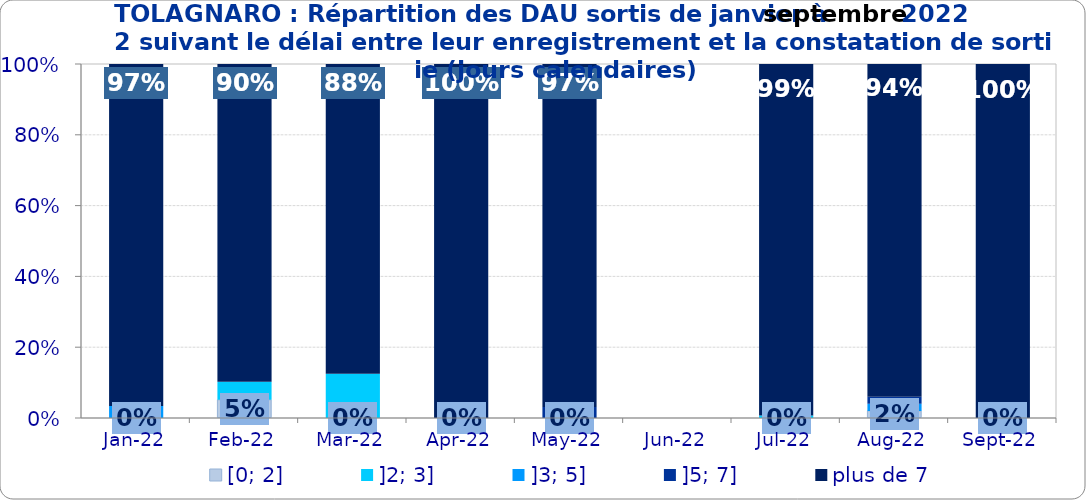
| Category | [0; 2] | ]2; 3] | ]3; 5] | ]5; 7] | plus de 7 |
|---|---|---|---|---|---|
| 2022-01-01 | 0 | 0 | 0.034 | 0 | 0.966 |
| 2022-02-01 | 0.051 | 0.051 | 0 | 0 | 0.897 |
| 2022-03-01 | 0 | 0.125 | 0 | 0 | 0.875 |
| 2022-04-01 | 0 | 0 | 0 | 0 | 1 |
| 2022-05-01 | 0 | 0 | 0 | 0.031 | 0.969 |
| 2022-06-01 | 0 | 0 | 0 | 0 | 0 |
| 2022-07-01 | 0 | 0.007 | 0 | 0 | 0.993 |
| 2022-08-01 | 0.02 | 0 | 0.02 | 0.02 | 0.94 |
| 2022-09-01 | 0 | 0 | 0 | 0 | 1 |